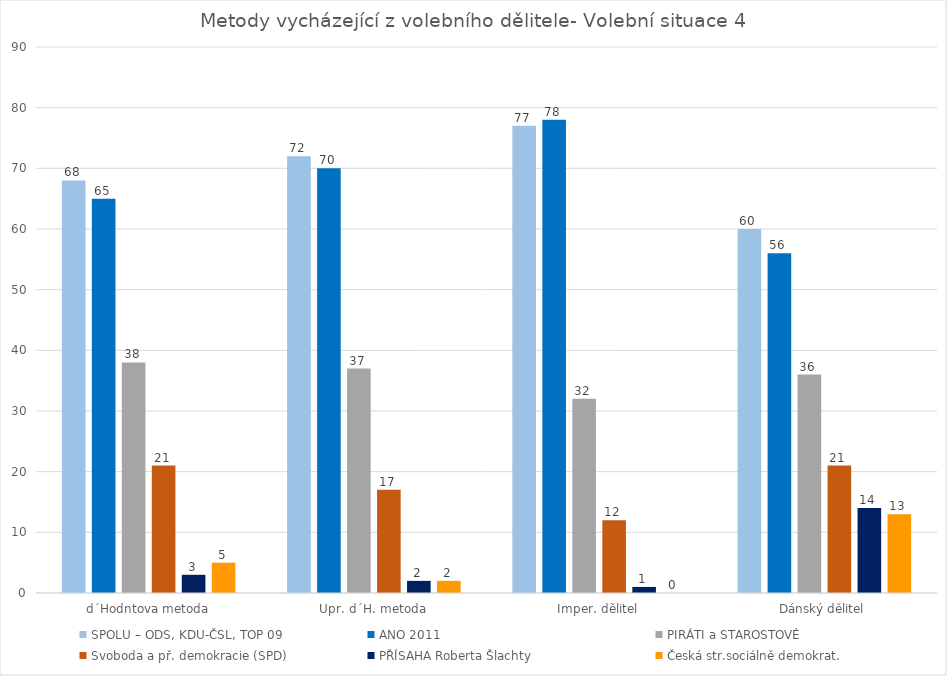
| Category | SPOLU – ODS, KDU-ČSL, TOP 09 | ANO 2011 | PIRÁTI a STAROSTOVÉ | Svoboda a př. demokracie (SPD) | PŘÍSAHA Roberta Šlachty | Česká str.sociálně demokrat. |
|---|---|---|---|---|---|---|
| d´Hodntova metoda | 68 | 65 | 38 | 21 | 3 | 5 |
| Upr. d´H. metoda | 72 | 70 | 37 | 17 | 2 | 2 |
| Imper. dělitel | 77 | 78 | 32 | 12 | 1 | 0 |
| Dánský dělitel | 60 | 56 | 36 | 21 | 14 | 13 |